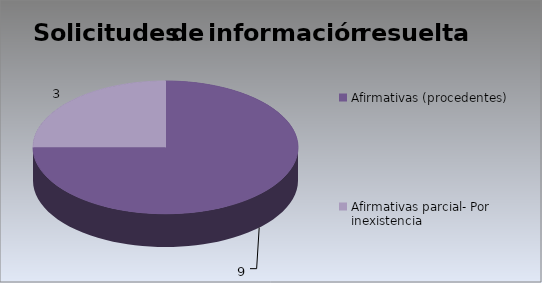
| Category | Series 0 |
|---|---|
| Afirmativas (procedentes) | 9 |
| Afirmativas parcial- Por inexistencia                                                                          | 3 |